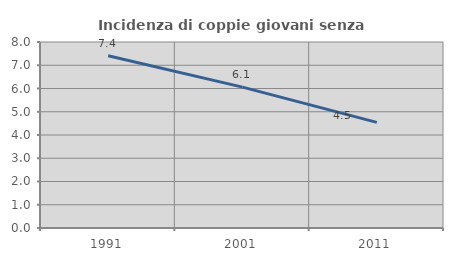
| Category | Incidenza di coppie giovani senza figli |
|---|---|
| 1991.0 | 7.411 |
| 2001.0 | 6.058 |
| 2011.0 | 4.541 |